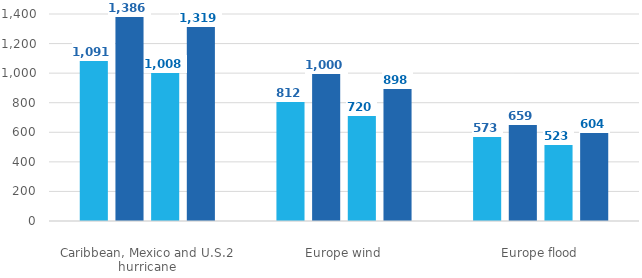
| Category | 2023 | 2022 |
|---|---|---|
| Caribbean, Mexico and U.S.2 hurricane | 1386 | 1319 |
| Europe wind | 1000 | 898 |
| Europe flood | 659 | 604 |